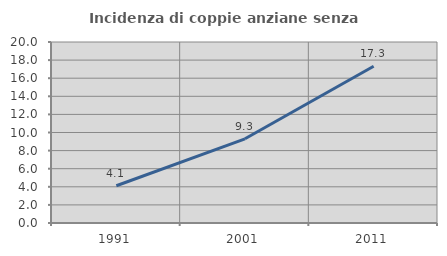
| Category | Incidenza di coppie anziane senza figli  |
|---|---|
| 1991.0 | 4.112 |
| 2001.0 | 9.302 |
| 2011.0 | 17.321 |